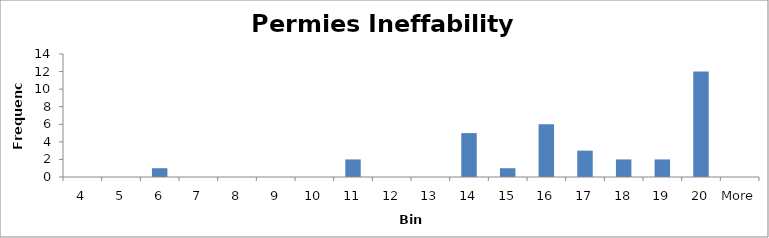
| Category | Frequency |
|---|---|
| 4 | 0 |
| 5 | 0 |
| 6 | 1 |
| 7 | 0 |
| 8 | 0 |
| 9 | 0 |
| 10 | 0 |
| 11 | 2 |
| 12 | 0 |
| 13 | 0 |
| 14 | 5 |
| 15 | 1 |
| 16 | 6 |
| 17 | 3 |
| 18 | 2 |
| 19 | 2 |
| 20 | 12 |
| More | 0 |